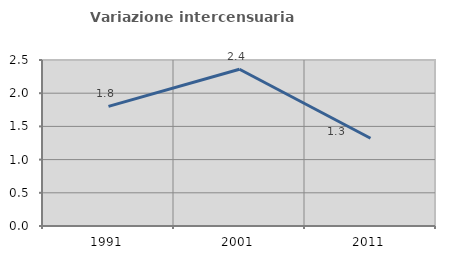
| Category | Variazione intercensuaria annua |
|---|---|
| 1991.0 | 1.801 |
| 2001.0 | 2.36 |
| 2011.0 | 1.322 |